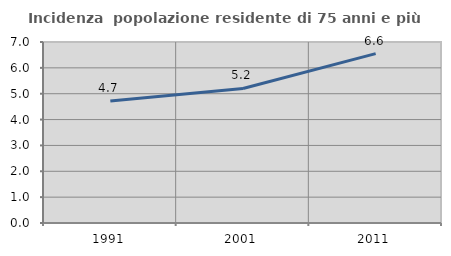
| Category | Incidenza  popolazione residente di 75 anni e più |
|---|---|
| 1991.0 | 4.715 |
| 2001.0 | 5.203 |
| 2011.0 | 6.551 |